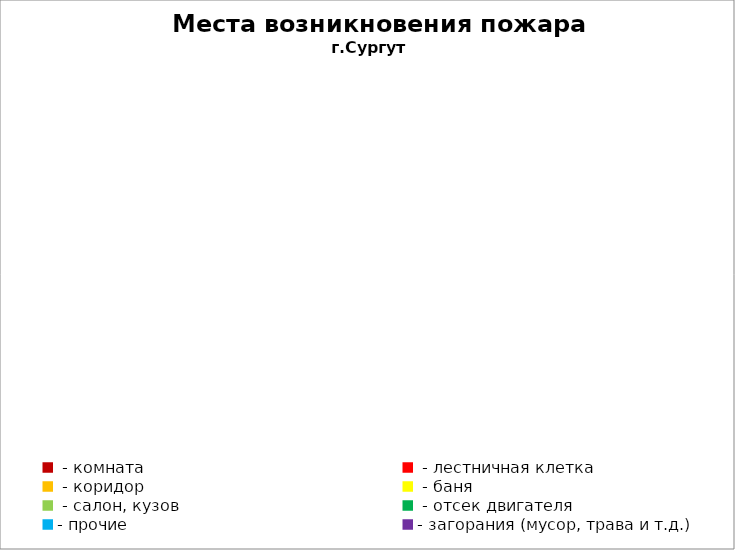
| Category | Места возникновения пожара |
|---|---|
|  - комната | 56 |
|  - лестничная клетка | 27 |
|  - коридор | 11 |
|  - баня | 28 |
|  - салон, кузов | 11 |
|  - отсек двигателя | 38 |
| - прочие | 154 |
| - загорания (мусор, трава и т.д.)  | 181 |